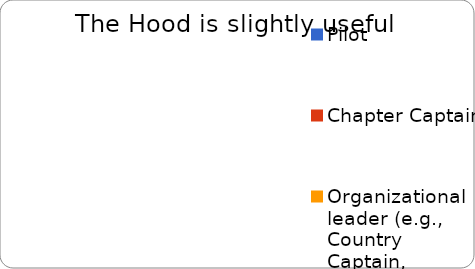
| Category | Slightly useful |
|---|---|
| Pilot | 0 |
| Chapter Captain | 0 |
| Organizational leader (e.g., Country Captain, member of The Hub) | 0 |